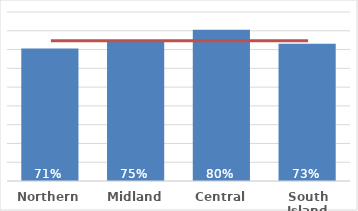
| Category | Māori |
|---|---|
| Northern | 0.706 |
| Midland | 0.748 |
| Central | 0.805 |
| South Island | 0.731 |